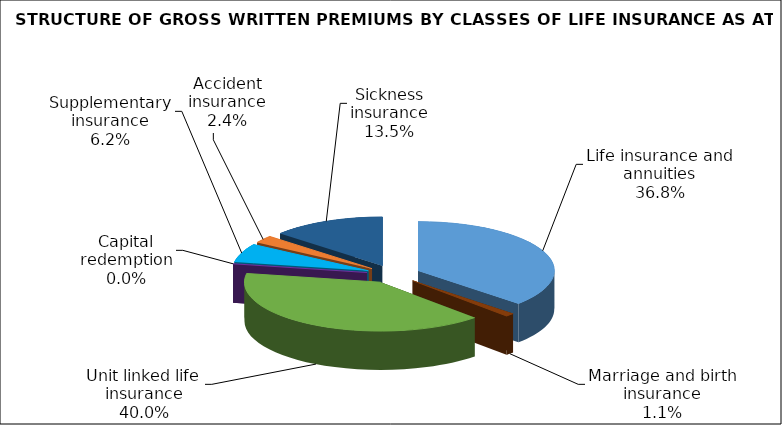
| Category | Series 0 |
|---|---|
| Life insurance and annuities | 146241088.977 |
| Marriage and birth insurance | 4372307.984 |
| Unit linked life insurance | 158829152.965 |
| Capital redemption | 0 |
| Supplementary insurance | 24556412.707 |
| Accident insurance | 9676226.52 |
| Sickness insurance | 53730077.66 |